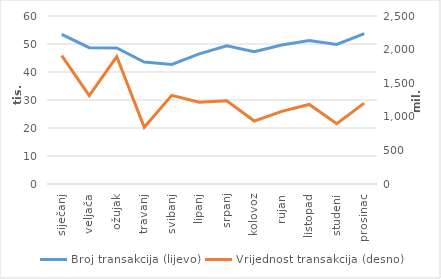
| Category | Broj transakcija (lijevo) |
|---|---|
| siječanj | 53441 |
| veljača | 48684 |
| ožujak | 48602 |
| travanj | 43548 |
| svibanj | 42708 |
| lipanj | 46492 |
| srpanj | 49321 |
| kolovoz | 47228 |
| rujan | 49661 |
| listopad | 51203 |
| studeni | 49846 |
| prosinac | 53718 |